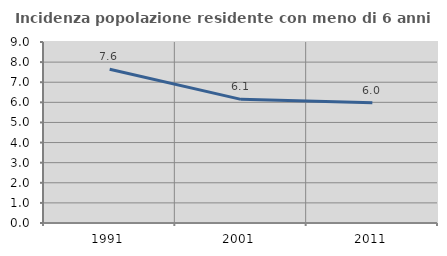
| Category | Incidenza popolazione residente con meno di 6 anni |
|---|---|
| 1991.0 | 7.648 |
| 2001.0 | 6.148 |
| 2011.0 | 5.982 |